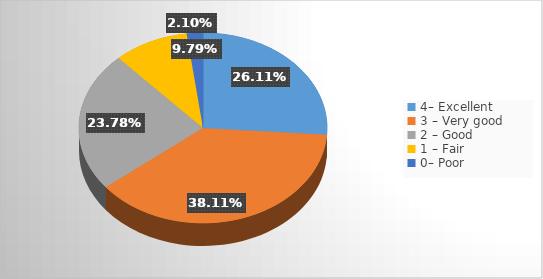
| Category | Series 0 |
|---|---|
| 4– Excellent        | 0.261 |
| 3 – Very good         | 0.381 |
| 2 – Good        | 0.238 |
| 1 – Fair         | 0.098 |
| 0– Poor | 0.021 |